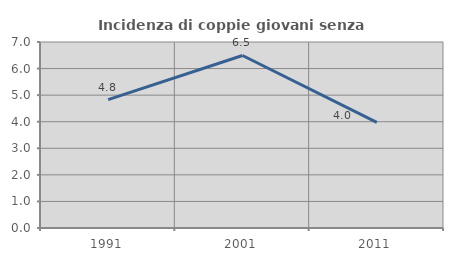
| Category | Incidenza di coppie giovani senza figli |
|---|---|
| 1991.0 | 4.834 |
| 2001.0 | 6.492 |
| 2011.0 | 3.974 |